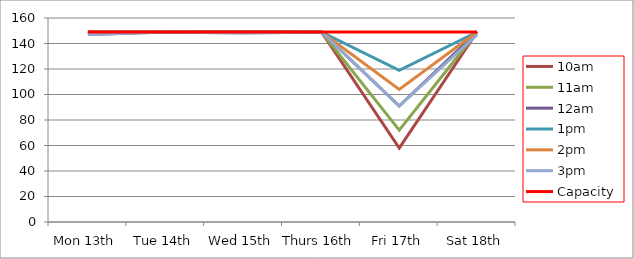
| Category | 9am | 10am | 11am | 12am | 1pm | 2pm | 3pm | 4pm | 5pm | Capacity |
|---|---|---|---|---|---|---|---|---|---|---|
| Mon 13th |  | 148 | 149 | 147 | 149 | 149 | 147 |  |  | 149 |
| Tue 14th |  | 149 | 149 | 149 | 149 | 149 | 149 |  |  | 149 |
| Wed 15th |  | 149 | 149 | 149 | 149 | 149 | 148 |  |  | 149 |
| Thurs 16th |  | 149 | 149 | 149 | 149 | 149 | 149 |  |  | 149 |
| Fri 17th |  | 58 | 72 | 91 | 119 | 104 | 91 |  |  | 149 |
| Sat 18th |  | 149 | 149 | 149 | 149 | 149 | 147 |  |  | 149 |